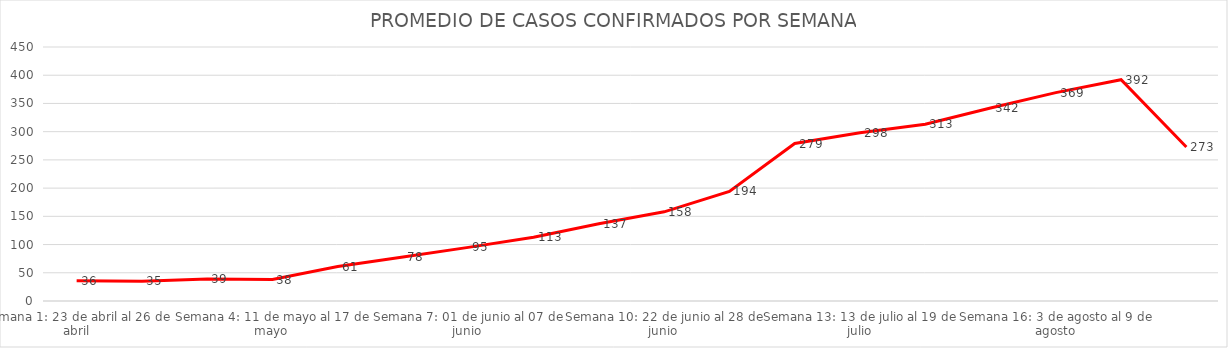
| Category | Series 0 |
|---|---|
| Semana 1: 23 de abril al 26 de abril | 36 |
| Semana 2: 27 de abril al 3 de mayo | 35 |
| Semana 3: 4 de mayo al 10 de mayo | 39 |
| Semana 4: 11 de mayo al 17 de mayo | 38 |
| Semana 5: 18 de mayo al 24 de mayo | 61 |
| Semana 6: 25 de mayo al 31 de mayo | 78 |
| Semana 7: 01 de junio al 07 de junio | 95 |
| Semana 8: 08 de junio al 14 de junio | 113 |
| Semana 9: 15 de junio al 21 de junio | 137 |
| Semana 10: 22 de junio al 28 de junio | 158 |
| Semana 11: 23 de junio al 5 de julio | 194 |
| Semana 12: 06 de julio al 12 de julio | 279 |
| Semana 13: 13 de julio al 19 de julio | 298 |
| Semana 14: 20 de julio al 26 de julio | 313 |
| Semana 15: 27 de julio al 2 de agosto | 342 |
| Semana 16: 3 de agosto al 9 de agosto | 369.143 |
| Semana 17: 10 de agosto al 17 de agosto | 392 |
| Semana 18: 18 de agosto al 23 de agosto | 272.857 |